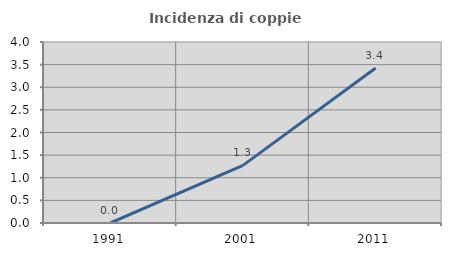
| Category | Incidenza di coppie miste |
|---|---|
| 1991.0 | 0 |
| 2001.0 | 1.274 |
| 2011.0 | 3.425 |